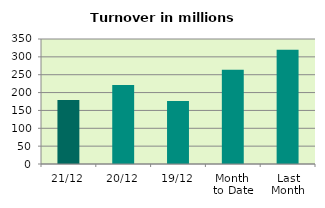
| Category | Series 0 |
|---|---|
| 21/12 | 179.193 |
| 20/12 | 221.301 |
| 19/12 | 176.745 |
| Month 
to Date | 263.66 |
| Last
Month | 319.611 |